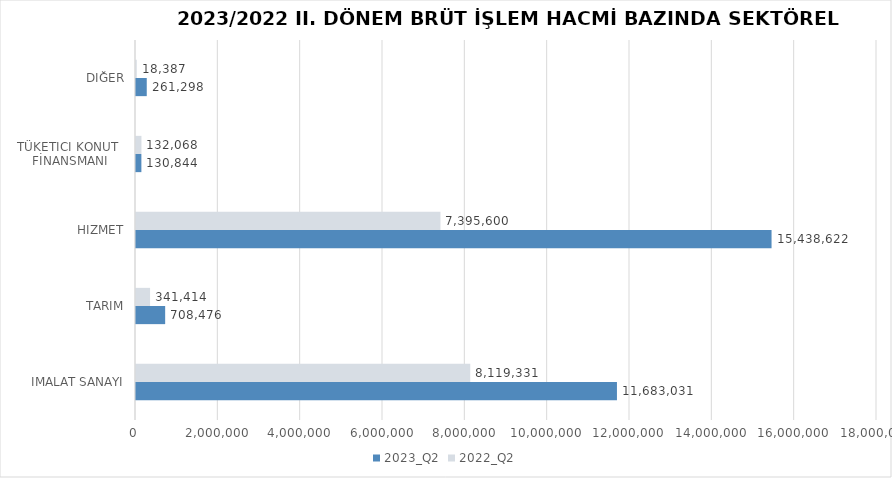
| Category | 2023_Q2 | 2022_Q2 |
|---|---|---|
| İMALAT SANAYİ | 11683030.577 | 8119330.631 |
| TARIM | 708476.389 | 341413.852 |
| HİZMET | 15438621.603 | 7395600.315 |
| TÜKETİCİ KONUT 
FİNANSMANI | 130844 | 132068 |
| DİĞER | 261298 | 18387 |